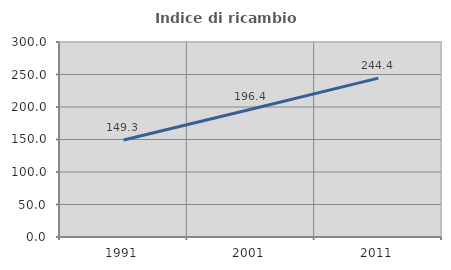
| Category | Indice di ricambio occupazionale  |
|---|---|
| 1991.0 | 149.275 |
| 2001.0 | 196.429 |
| 2011.0 | 244.444 |